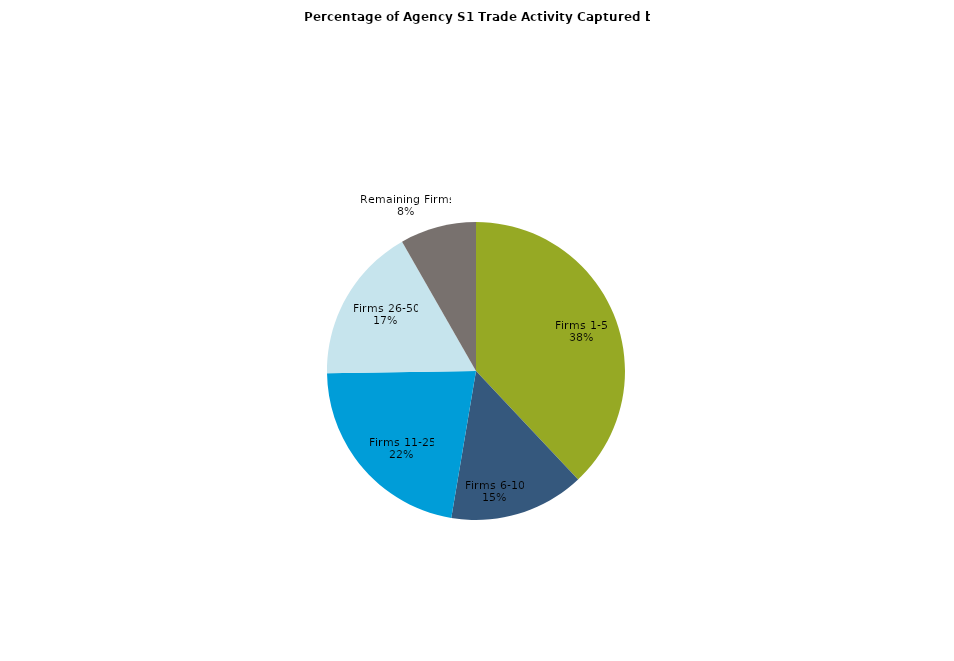
| Category | Series 0 |
|---|---|
| Firms 1-5 | 0.38 |
| Firms 6-10 | 0.147 |
| Firms 11-25 | 0.221 |
| Firms 26-50 | 0.17 |
| Remaining Firms | 0.083 |